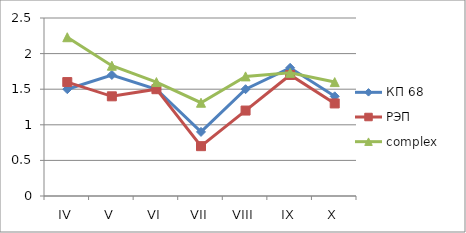
| Category | КП 68 | РЭП  | complex |
|---|---|---|---|
| IV | 1.5 | 1.6 | 2.23 |
| V | 1.7 | 1.4 | 1.83 |
| VI | 1.5 | 1.5 | 1.6 |
| VII | 0.9 | 0.7 | 1.31 |
| VIII | 1.5 | 1.2 | 1.68 |
| IX | 1.8 | 1.7 | 1.73 |
| X | 1.4 | 1.3 | 1.6 |